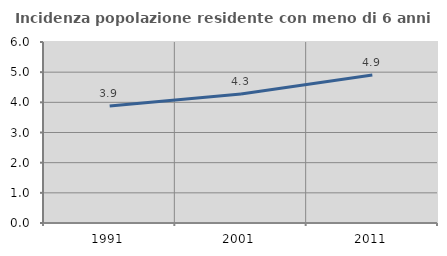
| Category | Incidenza popolazione residente con meno di 6 anni |
|---|---|
| 1991.0 | 3.875 |
| 2001.0 | 4.275 |
| 2011.0 | 4.907 |